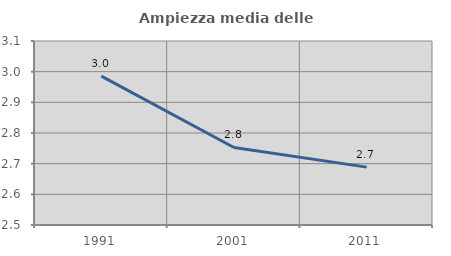
| Category | Ampiezza media delle famiglie |
|---|---|
| 1991.0 | 2.986 |
| 2001.0 | 2.753 |
| 2011.0 | 2.689 |